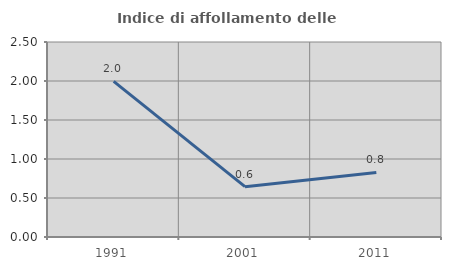
| Category | Indice di affollamento delle abitazioni  |
|---|---|
| 1991.0 | 1.995 |
| 2001.0 | 0.645 |
| 2011.0 | 0.827 |